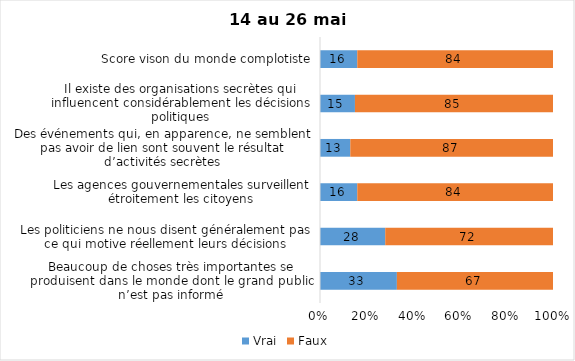
| Category | Vrai | Faux |
|---|---|---|
| Beaucoup de choses très importantes se produisent dans le monde dont le grand public n’est pas informé | 33 | 67 |
| Les politiciens ne nous disent généralement pas ce qui motive réellement leurs décisions | 28 | 72 |
| Les agences gouvernementales surveillent étroitement les citoyens | 16 | 84 |
| Des événements qui, en apparence, ne semblent pas avoir de lien sont souvent le résultat d’activités secrètes | 13 | 87 |
| Il existe des organisations secrètes qui influencent considérablement les décisions politiques | 15 | 85 |
| Score vison du monde complotiste | 16 | 84 |